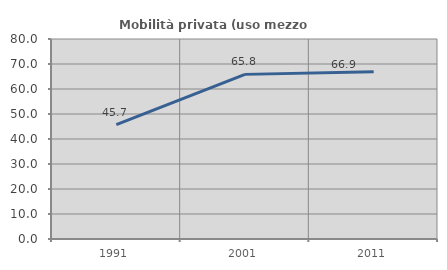
| Category | Mobilità privata (uso mezzo privato) |
|---|---|
| 1991.0 | 45.71 |
| 2001.0 | 65.85 |
| 2011.0 | 66.92 |